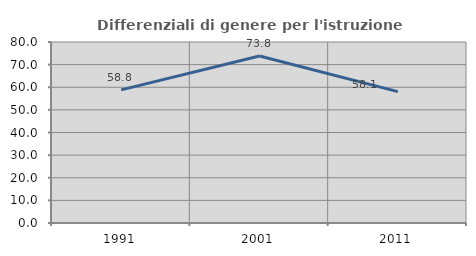
| Category | Differenziali di genere per l'istruzione superiore |
|---|---|
| 1991.0 | 58.828 |
| 2001.0 | 73.839 |
| 2011.0 | 58.057 |